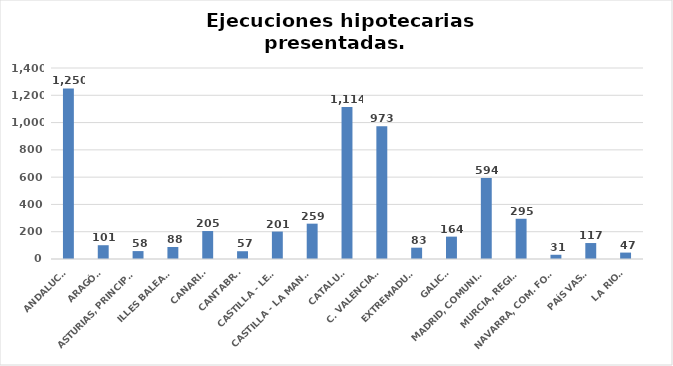
| Category | Series 0 |
|---|---|
| ANDALUCÍA | 1250 |
| ARAGÓN | 101 |
| ASTURIAS, PRINCIPADO | 58 |
| ILLES BALEARS | 88 |
| CANARIAS | 205 |
| CANTABRIA | 57 |
| CASTILLA - LEÓN | 201 |
| CASTILLA - LA MANCHA | 259 |
| CATALUÑA | 1114 |
| C. VALENCIANA | 973 |
| EXTREMADURA | 83 |
| GALICIA | 164 |
| MADRID, COMUNIDAD | 594 |
| MURCIA, REGIÓN | 295 |
| NAVARRA, COM. FORAL | 31 |
| PAÍS VASCO | 117 |
| LA RIOJA | 47 |